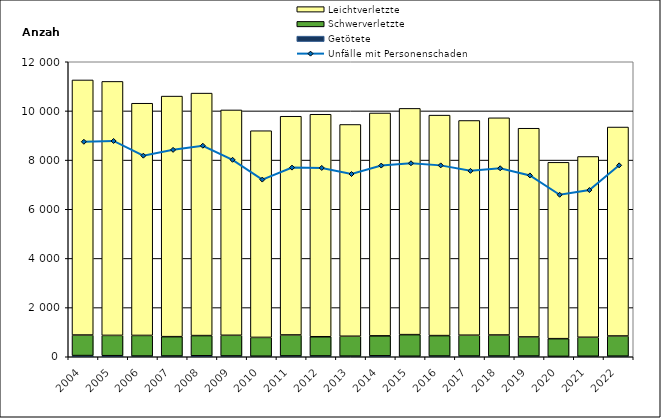
| Category | Getötete | Schwerverletzte | Leichtverletzte |
|---|---|---|---|
| 2004.0 | 48 | 836 | 10376 |
| 2005.0 | 43 | 826 | 10332 |
| 2006.0 | 28 | 839 | 9446 |
| 2007.0 | 30 | 787 | 9786 |
| 2008.0 | 40 | 821 | 9864 |
| 2009.0 | 33 | 840 | 9167 |
| 2010.0 | 22 | 765 | 8408 |
| 2011.0 | 34 | 853 | 8897 |
| 2012.0 | 33 | 781 | 9051 |
| 2013.0 | 26 | 808 | 8615 |
| 2014.0 | 38 | 812 | 9066 |
| 2015.0 | 20 | 880 | 9203 |
| 2016.0 | 29 | 831 | 8969 |
| 2017.0 | 28 | 849 | 8734 |
| 2018.0 | 29 | 856 | 8835 |
| 2019.0 | 28 | 778 | 8490 |
| 2020.0 | 15 | 721 | 7173 |
| 2021.0 | 20 | 773 | 7354 |
| 2022.0 | 24 | 821 | 8500 |